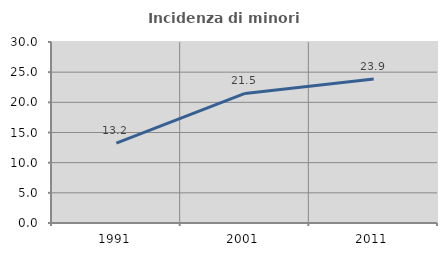
| Category | Incidenza di minori stranieri |
|---|---|
| 1991.0 | 13.235 |
| 2001.0 | 21.471 |
| 2011.0 | 23.864 |